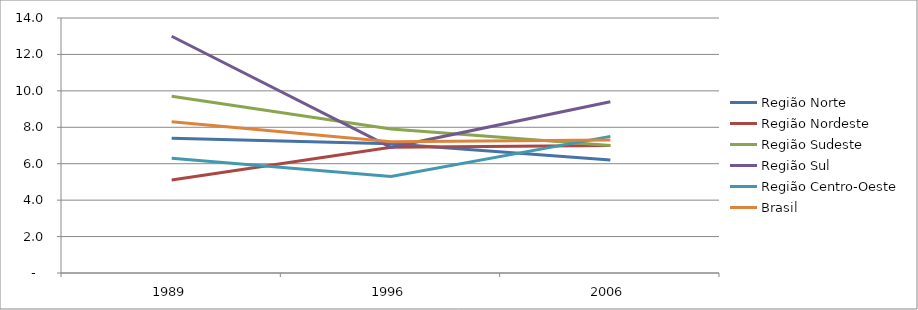
| Category | Região Norte | Região Nordeste | Região Sudeste | Região Sul | Região Centro-Oeste | Brasil |
|---|---|---|---|---|---|---|
| 1989.0 | 7.4 | 5.1 | 9.7 | 13 | 6.3 | 8.3 |
| 1996.0 | 7.1 | 6.9 | 7.9 | 6.9 | 5.3 | 7.2 |
| 2006.0 | 6.2 | 7 | 7 | 9.4 | 7.5 | 7.3 |